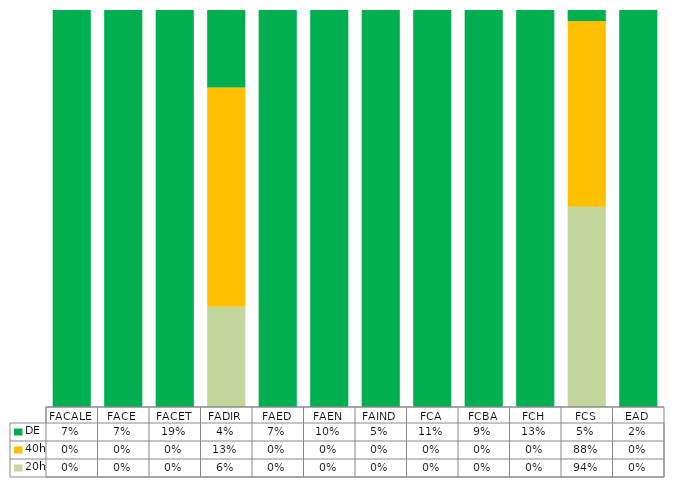
| Category | 20h | 40h | DE |
|---|---|---|---|
| FACALE | 0 | 0 | 0.066 |
| FACE | 0 | 0 | 0.074 |
| FACET | 0 | 0 | 0.191 |
| FADIR | 0.057 | 0.125 | 0.044 |
| FAED | 0 | 0 | 0.072 |
| FAEN | 0 | 0 | 0.101 |
| FAIND | 0 | 0 | 0.05 |
| FCA | 0 | 0 | 0.114 |
| FCBA | 0 | 0 | 0.086 |
| FCH | 0 | 0 | 0.131 |
| FCS | 0.943 | 0.875 | 0.051 |
| EAD | 0 | 0 | 0.02 |